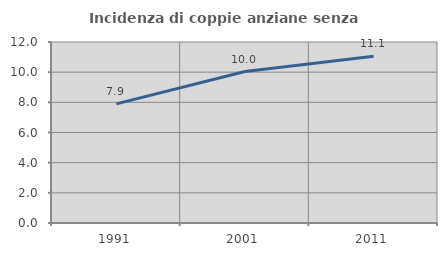
| Category | Incidenza di coppie anziane senza figli  |
|---|---|
| 1991.0 | 7.898 |
| 2001.0 | 10.043 |
| 2011.0 | 11.06 |